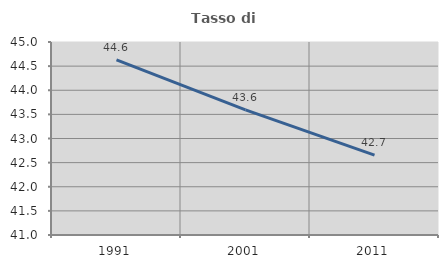
| Category | Tasso di occupazione   |
|---|---|
| 1991.0 | 44.63 |
| 2001.0 | 43.594 |
| 2011.0 | 42.656 |